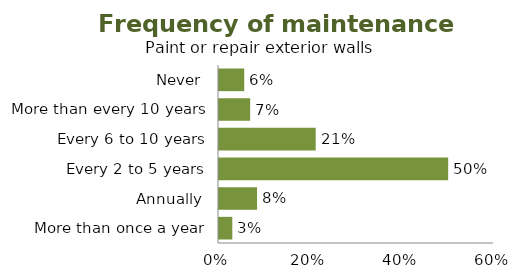
| Category | % |
|---|---|
| More than once a year | 0.029 |
| Annually | 0.083 |
| Every 2 to 5 years | 0.5 |
| Every 6 to 10 years | 0.211 |
| More than every 10 years | 0.068 |
| Never | 0.055 |